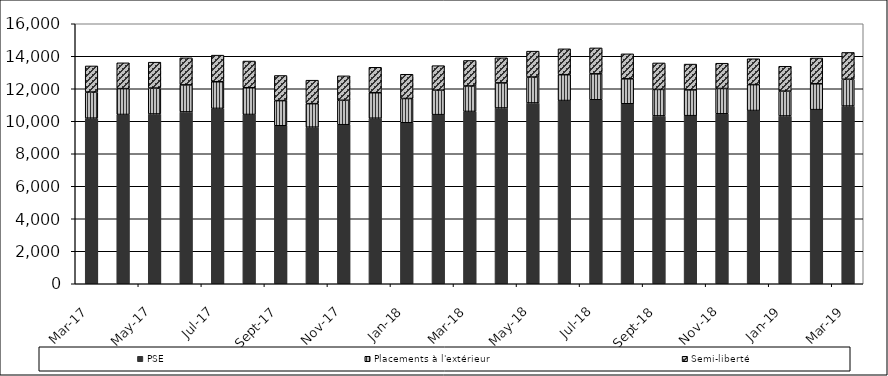
| Category | PSE | Placements à l'extérieur | Semi-liberté |
|---|---|---|---|
| 2017-03-01 | 10190 | 1607 | 1607 |
| 2017-04-01 | 10417 | 1590 | 1590 |
| 2017-05-01 | 10448 | 1594 | 1594 |
| 2017-06-01 | 10575 | 1664 | 1664 |
| 2017-07-01 | 10791 | 1639 | 1639 |
| 2017-08-01 | 10417 | 1644 | 1644 |
| 2017-09-01 | 9723 | 1547 | 1547 |
| 2017-10-01 | 9637 | 1445 | 1445 |
| 2017-11-01 | 9787 | 1504 | 1504 |
| 2017-12-01 | 10187 | 1568 | 1568 |
| 2018-01-01 | 9907 | 1493 | 1493 |
| 2018-02-01 | 10406 | 1508 | 1508 |
| 2018-03-01 | 10603 | 1569 | 1569 |
| 2018-04-01 | 10817 | 1544 | 1544 |
| 2018-05-01 | 11127 | 1594 | 1594 |
| 2018-06-01 | 11275 | 1591 | 1591 |
| 2018-07-01 | 11322 | 1596 | 1596 |
| 2018-08-01 | 11075 | 1537 | 1537 |
| 2018-09-01 | 10329 | 1630 | 1630 |
| 2018-10-01 | 10344 | 1587 | 1587 |
| 2018-11-01 | 10458 | 1557 | 1557 |
| 2018-12-01 | 10661 | 1593 | 1593 |
| 2019-01-01 | 10325 | 1530 | 1530 |
| 2019-02-01 | 10715 | 1589 | 1589 |
| 2019-03-01 | 10935 | 1650 | 1650 |